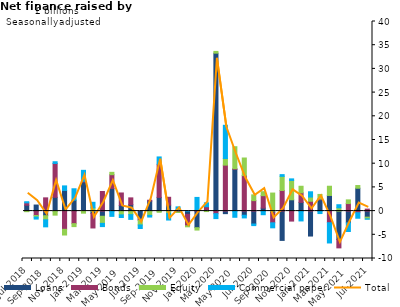
| Category | Loans | Bonds | Equity | Commercial paper |
|---|---|---|---|---|
| Mar-2018 | 0.692 | -0.433 | -0.127 | -0.357 |
| Apr-2018 | 1.182 | -2.435 | -0.178 | 2.532 |
| May-2018 | 1.117 | 11.031 | 0.134 | -0.33 |
| Jun-2018 | 0.86 | 0.294 | 0.01 | -0.977 |
| Jul-2018 | 1.023 | 0.494 | -0.031 | 0.233 |
| Aug-2018 | 1.297 | -0.932 | -0.325 | -0.431 |
| Sep-2018 | -1.01 | 2.795 | -0.79 | -1.484 |
| Oct-2018 | 3.08 | 7.138 | -0.944 | 0.363 |
| Nov-2018 | 4.298 | -3.846 | -1.245 | 0.958 |
| Dec-2018 | 2.433 | -2.65 | -0.684 | 2.407 |
| Jan-2019 | 6.324 | 0.161 | -0.539 | 2.312 |
| Feb-2019 | -0.69 | -3.084 | -0.687 | 1.181 |
| Mar-2019 | -1.376 | 4.131 | -1.576 | -0.683 |
| Apr-2019 | 4.622 | 2.92 | 0.616 | -1.109 |
| May-2019 | 1.222 | 2.622 | -0.762 | -0.561 |
| Jun-2019 | 1.893 | 1.437 | -0.709 | -1.001 |
| Jul-2019 | -1.856 | -0.281 | -0.944 | -0.742 |
| Aug-2019 | 1.984 | 0.174 | -0.888 | -0.357 |
| Sep-2019 | 2.88 | 6.981 | -0.211 | 1.548 |
| Oct-2019 | 1.209 | 1.651 | -0.552 | -1.416 |
| Nov-2019 | 0.375 | -0.195 | -0.125 | 0.654 |
| Dec-2019 | -0.557 | -2.415 | -0.268 | 0.031 |
| Jan-2020 | -3.26 | 0.155 | -0.586 | 2.731 |
| Feb-2020 | -0.025 | 0.764 | -0.025 | 0.826 |
| Mar-2020 | 32.963 | -0.54 | 0.475 | -1.041 |
| Apr-2020 | -0.845 | 9.698 | 1.398 | 7.014 |
| May-2020 | 8.8 | 0.131 | 4.69 | -1.303 |
| Jun-2020 | 0.005 | 7.494 | 3.717 | -0.564 |
| Jul-2020 | -3.196 | 2.212 | 1.137 | -0.34 |
| Aug-2020 | 0.657 | 2.614 | 0.867 | -0.762 |
| Sep-2020 | -0.202 | -2.122 | 3.801 | -1.058 |
| Oct-2020 | -6.414 | 4.349 | 2.922 | 0.366 |
| Nov-2020 | 2.568 | -2.106 | 4.073 | 0.327 |
| Dec-2020 | 2.022 | 2.015 | 1.327 | -2.076 |
| Jan-2021 | -5.136 | 2.081 | 0.817 | 1.11 |
| Feb-2021 | 2.259 | 0.193 | 1.007 | -0.517 |
| Mar-2021 | 3.103 | -2.452 | 0.57 | -4.272 |